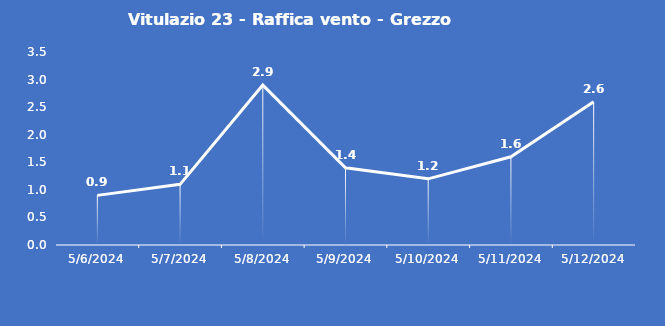
| Category | Vitulazio 23 - Raffica vento - Grezzo (m/s) |
|---|---|
| 5/6/24 | 0.9 |
| 5/7/24 | 1.1 |
| 5/8/24 | 2.9 |
| 5/9/24 | 1.4 |
| 5/10/24 | 1.2 |
| 5/11/24 | 1.6 |
| 5/12/24 | 2.6 |